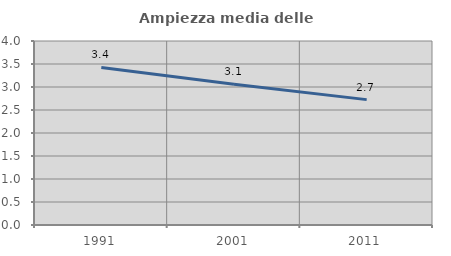
| Category | Ampiezza media delle famiglie |
|---|---|
| 1991.0 | 3.426 |
| 2001.0 | 3.058 |
| 2011.0 | 2.726 |